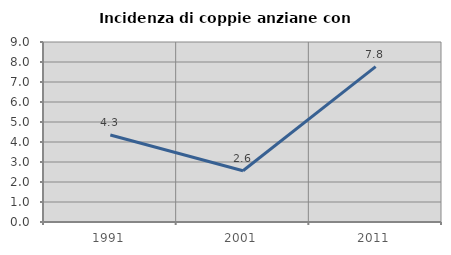
| Category | Incidenza di coppie anziane con figli |
|---|---|
| 1991.0 | 4.348 |
| 2001.0 | 2.564 |
| 2011.0 | 7.767 |